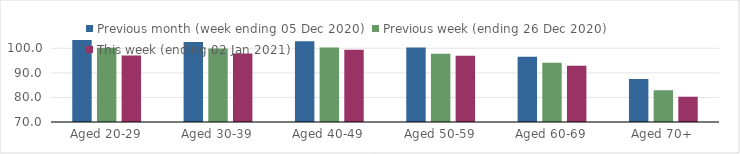
| Category | Previous month (week ending 05 Dec 2020) | Previous week (ending 26 Dec 2020) | This week (ending 02 Jan 2021) |
|---|---|---|---|
| Aged 20-29 | 103.34 | 100.26 | 97.06 |
| Aged 30-39 | 102.54 | 99.89 | 97.84 |
| Aged 40-49 | 102.84 | 100.32 | 99.45 |
| Aged 50-59 | 100.36 | 97.78 | 96.94 |
| Aged 60-69 | 96.56 | 94.16 | 92.91 |
| Aged 70+ | 87.55 | 82.93 | 80.29 |